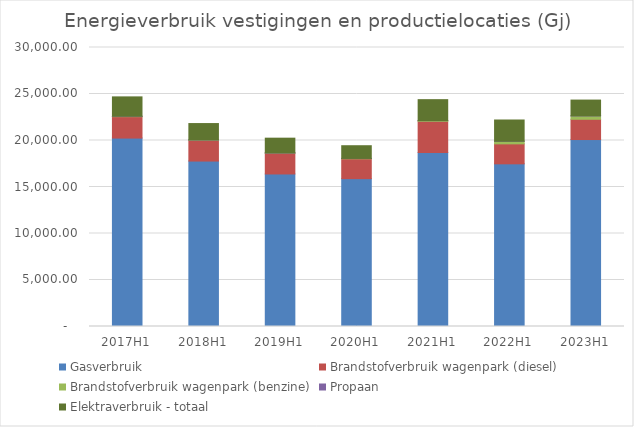
| Category | Gasverbruik | Brandstofverbruik wagenpark (diesel) | Brandstofverbruik wagenpark (benzine) | Propaan | Elektraverbruik - totaal |
|---|---|---|---|---|---|
| 2017H1 | 20260.653 | 2299.716 | 43.644 | 6.607 | 2079.601 |
| 2018H1 | 17788.946 | 2235.943 | 41.322 | 5.082 | 1750.554 |
| 2019H1 | 16400.903 | 2245.322 | 14.378 | 5.844 | 1584.331 |
| 2020H1 | 15897.415 | 2134.024 | 38.03 | 2.795 | 1366.942 |
| 2021H1 | 18701.384 | 3358.655 | 78.603 | 3.049 | 2249.975 |
| 2022H1 | 17490.486 | 2147.815 | 280.918 | 2.287 | 2283.394 |
| 2023H1 | 20102.308 | 2178.148 | 366.329 | 6.607 | 1693.254 |